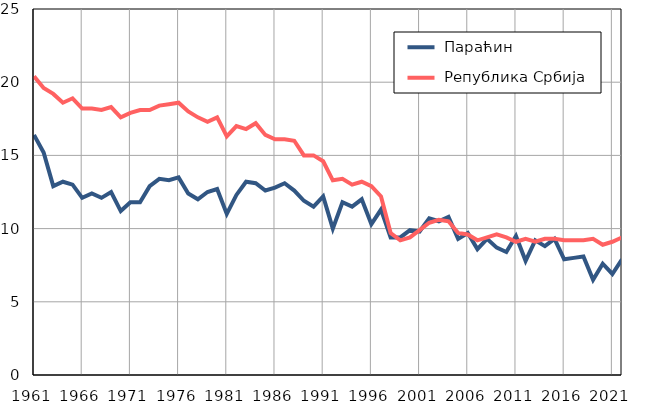
| Category |  Параћин |  Република Србија |
|---|---|---|
| 1961.0 | 16.4 | 20.4 |
| 1962.0 | 15.2 | 19.6 |
| 1963.0 | 12.9 | 19.2 |
| 1964.0 | 13.2 | 18.6 |
| 1965.0 | 13 | 18.9 |
| 1966.0 | 12.1 | 18.2 |
| 1967.0 | 12.4 | 18.2 |
| 1968.0 | 12.1 | 18.1 |
| 1969.0 | 12.5 | 18.3 |
| 1970.0 | 11.2 | 17.6 |
| 1971.0 | 11.8 | 17.9 |
| 1972.0 | 11.8 | 18.1 |
| 1973.0 | 12.9 | 18.1 |
| 1974.0 | 13.4 | 18.4 |
| 1975.0 | 13.3 | 18.5 |
| 1976.0 | 13.5 | 18.6 |
| 1977.0 | 12.4 | 18 |
| 1978.0 | 12 | 17.6 |
| 1979.0 | 12.5 | 17.3 |
| 1980.0 | 12.7 | 17.6 |
| 1981.0 | 11 | 16.3 |
| 1982.0 | 12.3 | 17 |
| 1983.0 | 13.2 | 16.8 |
| 1984.0 | 13.1 | 17.2 |
| 1985.0 | 12.6 | 16.4 |
| 1986.0 | 12.8 | 16.1 |
| 1987.0 | 13.1 | 16.1 |
| 1988.0 | 12.6 | 16 |
| 1989.0 | 11.9 | 15 |
| 1990.0 | 11.5 | 15 |
| 1991.0 | 12.2 | 14.6 |
| 1992.0 | 10 | 13.3 |
| 1993.0 | 11.8 | 13.4 |
| 1994.0 | 11.5 | 13 |
| 1995.0 | 12 | 13.2 |
| 1996.0 | 10.3 | 12.9 |
| 1997.0 | 11.3 | 12.2 |
| 1998.0 | 9.4 | 9.7 |
| 1999.0 | 9.4 | 9.2 |
| 2000.0 | 9.9 | 9.4 |
| 2001.0 | 9.8 | 9.9 |
| 2002.0 | 10.7 | 10.4 |
| 2003.0 | 10.5 | 10.6 |
| 2004.0 | 10.8 | 10.5 |
| 2005.0 | 9.3 | 9.7 |
| 2006.0 | 9.7 | 9.6 |
| 2007.0 | 8.6 | 9.2 |
| 2008.0 | 9.3 | 9.4 |
| 2009.0 | 8.7 | 9.6 |
| 2010.0 | 8.4 | 9.4 |
| 2011.0 | 9.5 | 9.1 |
| 2012.0 | 7.8 | 9.3 |
| 2013.0 | 9.2 | 9.1 |
| 2014.0 | 8.8 | 9.3 |
| 2015.0 | 9.3 | 9.3 |
| 2016.0 | 7.9 | 9.2 |
| 2017.0 | 8 | 9.2 |
| 2018.0 | 8.1 | 9.2 |
| 2019.0 | 6.5 | 9.3 |
| 2020.0 | 7.6 | 8.9 |
| 2021.0 | 6.9 | 9.1 |
| 2022.0 | 7.9 | 9.4 |